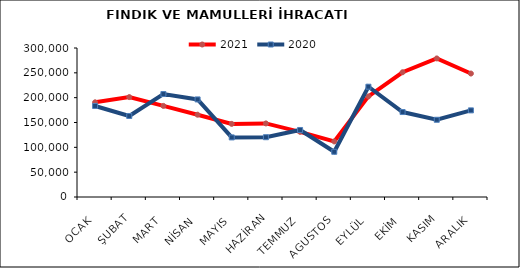
| Category | 2021 | 2020 |
|---|---|---|
| OCAK | 190660.467 | 183299.713 |
| ŞUBAT | 201167.372 | 163093.919 |
| MART | 183441.243 | 207313.632 |
| NİSAN | 165697.966 | 196459.369 |
| MAYIS | 147226.883 | 119975.599 |
| HAZİRAN | 148132.032 | 120394.22 |
| TEMMUZ | 131222.227 | 134930.976 |
| AGUSTOS | 111896.587 | 91056.768 |
| EYLÜL | 202523.563 | 222071.385 |
| EKİM | 251164.072 | 171070.264 |
| KASIM | 278991.483 | 155501.676 |
| ARALIK | 248573.983 | 174397.993 |